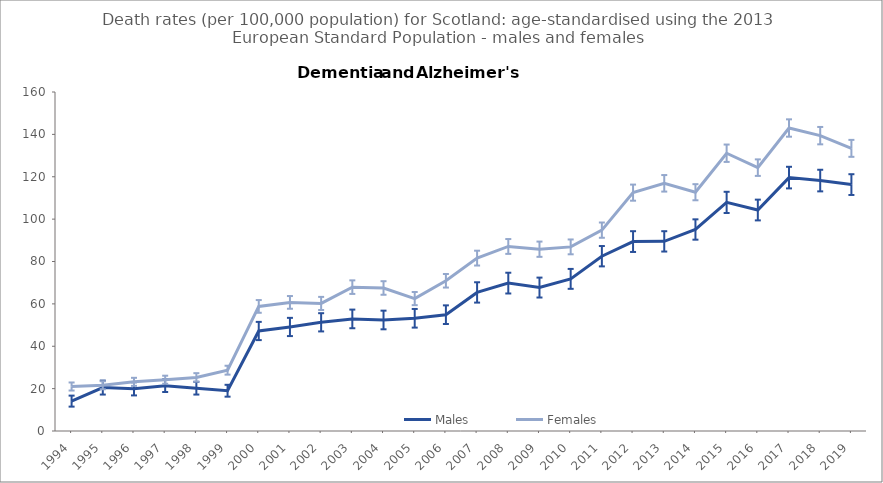
| Category | Males | Females |
|---|---|---|
| 1994.0 | 14.1 | 21 |
| 1995.0 | 20.5 | 21.6 |
| 1996.0 | 19.9 | 23.2 |
| 1997.0 | 21.4 | 24.2 |
| 1998.0 | 20.2 | 25.3 |
| 1999.0 | 19 | 28.7 |
| 2000.0 | 47.2 | 58.8 |
| 2001.0 | 49.1 | 60.7 |
| 2002.0 | 51.3 | 60.2 |
| 2003.0 | 52.9 | 67.9 |
| 2004.0 | 52.4 | 67.5 |
| 2005.0 | 53.2 | 62.5 |
| 2006.0 | 54.9 | 70.9 |
| 2007.0 | 65.4 | 81.6 |
| 2008.0 | 69.8 | 87.1 |
| 2009.0 | 67.7 | 85.8 |
| 2010.0 | 71.8 | 86.9 |
| 2011.0 | 82.5 | 94.8 |
| 2012.0 | 89.4 | 112.5 |
| 2013.0 | 89.5 | 116.9 |
| 2014.0 | 95.1 | 112.7 |
| 2015.0 | 107.9 | 131.1 |
| 2016.0 | 104.3 | 124.3 |
| 2017.0 | 119.6 | 143 |
| 2018.0 | 118.2 | 139.4 |
| 2019.0 | 116.3 | 133.4 |